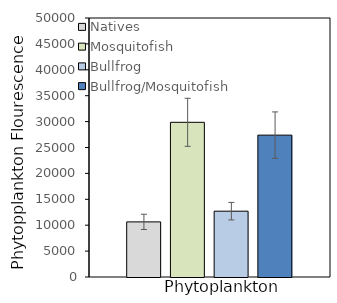
| Category | Natives | Mosquitofish | Bullfrog | Bullfrog/Mosquitofish |
|---|---|---|---|---|
| Phytoplankton | 10641.2 | 29864.48 | 12706.8 | 27387.28 |